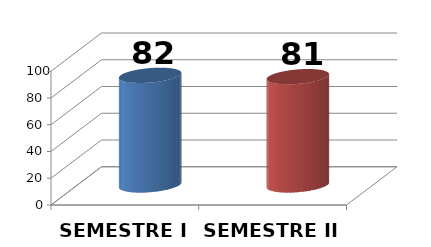
| Category | Series 0 |
|---|---|
| SEMESTRE I | 82 |
| SEMESTRE II | 81 |